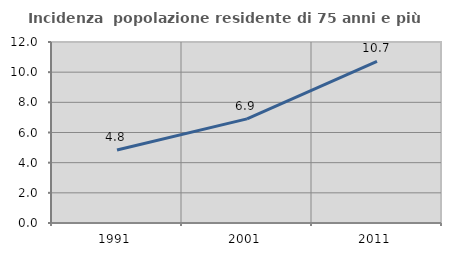
| Category | Incidenza  popolazione residente di 75 anni e più |
|---|---|
| 1991.0 | 4.841 |
| 2001.0 | 6.902 |
| 2011.0 | 10.713 |